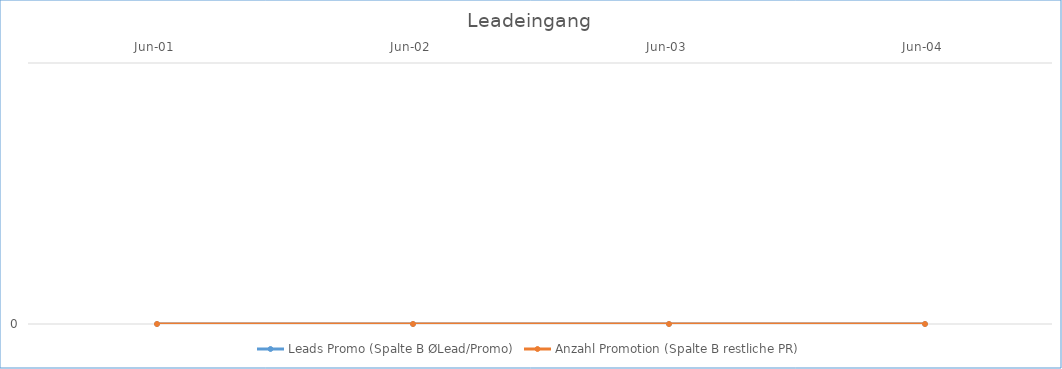
| Category | Leads Promo (Spalte B ØLead/Promo) | Anzahl Promotion (Spalte B restliche PR) |
|---|---|---|
| 2001-06-01 | 0 | 0 |
| 2002-06-01 | 0 | 0 |
| 2003-06-01 | 0 | 0 |
| 2004-06-01 | 0 | 0 |